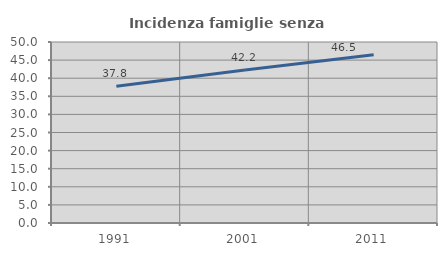
| Category | Incidenza famiglie senza nuclei |
|---|---|
| 1991.0 | 37.764 |
| 2001.0 | 42.236 |
| 2011.0 | 46.457 |